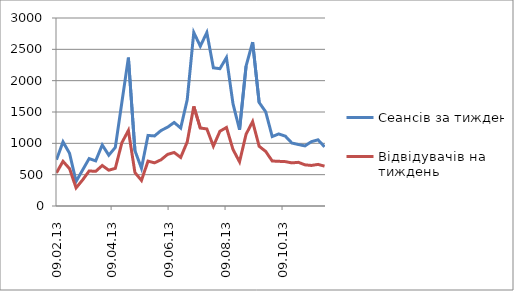
| Category | Сеансів за тиждень | Відвідувачів на тиждень |
|---|---|---|
| 2013-02-09 | 738 | 529 |
| 2013-02-16 | 1023 | 713 |
| 2013-02-23 | 841 | 596 |
| 2013-03-02 | 392 | 289 |
| 2013-03-09 | 575 | 416 |
| 2013-03-16 | 757 | 559 |
| 2013-03-23 | 720 | 553 |
| 2013-03-30 | 974 | 646 |
| 2013-04-06 | 811 | 571 |
| 2013-04-13 | 936 | 601 |
| 2013-04-20 | 1651 | 1009 |
| 2013-04-27 | 2368 | 1205 |
| 2013-05-04 | 884 | 534 |
| 2013-05-11 | 602 | 408 |
| 2013-05-18 | 1126 | 716 |
| 2013-05-25 | 1118 | 689 |
| 2013-06-01 | 1205 | 738 |
| 2013-06-08 | 1258 | 824 |
| 2013-06-15 | 1333 | 854 |
| 2013-06-22 | 1244 | 775 |
| 2013-06-29 | 1696 | 1023 |
| 2013-07-06 | 2769 | 1590 |
| 2013-07-13 | 2550 | 1244 |
| 2013-07-20 | 2768 | 1230 |
| 2013-07-27 | 2205 | 955 |
| 2013-08-03 | 2191 | 1193 |
| 2013-08-10 | 2369 | 1253 |
| 2013-08-17 | 1631 | 902 |
| 2013-08-24 | 1217 | 705 |
| 2013-08-31 | 2232 | 1145 |
| 2013-09-07 | 2614 | 1347 |
| 2013-09-14 | 1652 | 953 |
| 2013-09-21 | 1503 | 871 |
| 2013-09-28 | 1108 | 718 |
| 2013-10-05 | 1150 | 713 |
| 2013-10-12 | 1115 | 708 |
| 2013-10-19 | 1005 | 688 |
| 2013-10-26 | 981 | 697 |
| 2013-11-02 | 959 | 657 |
| 2013-11-09 | 1027 | 647 |
| 2013-11-16 | 1056 | 664 |
| 2013-11-23 | 945 | 636 |